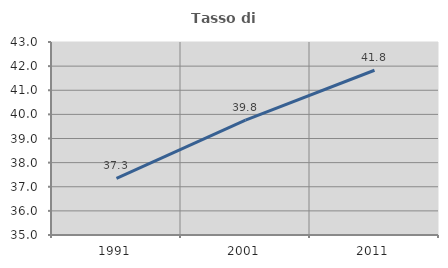
| Category | Tasso di occupazione   |
|---|---|
| 1991.0 | 37.344 |
| 2001.0 | 39.762 |
| 2011.0 | 41.829 |